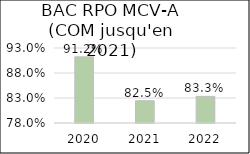
| Category | BAC PRO MCV-A 
(COMMERCE  jusqu'à 2021) |
|---|---|
| 2020.0 | 0.912 |
| 2021.0 | 0.825 |
| 2022.0 | 0.833 |